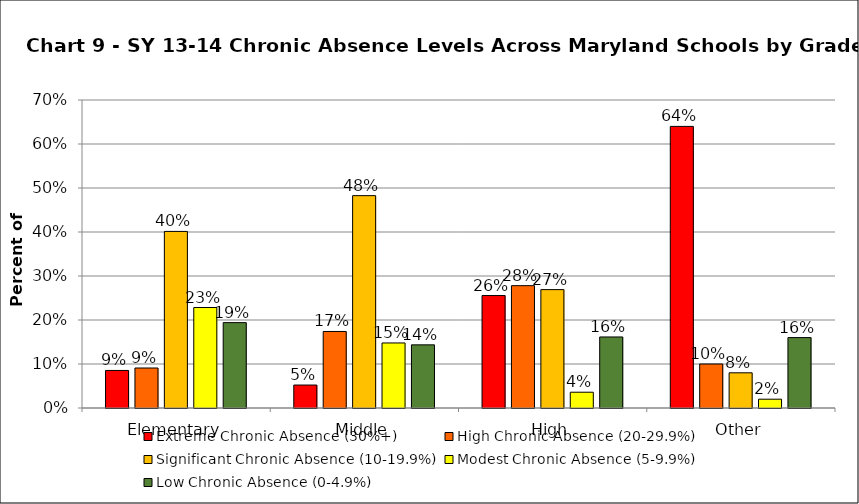
| Category | Extreme Chronic Absence (30%+) | High Chronic Absence (20-29.9%) | Significant Chronic Absence (10-19.9%) | Modest Chronic Absence (5-9.9%) | Low Chronic Absence (0-4.9%) |
|---|---|---|---|---|---|
| 0 | 0.085 | 0.091 | 0.401 | 0.228 | 0.194 |
| 1 | 0.052 | 0.174 | 0.483 | 0.148 | 0.143 |
| 2 | 0.256 | 0.278 | 0.269 | 0.036 | 0.161 |
| 3 | 0.64 | 0.1 | 0.08 | 0.02 | 0.16 |